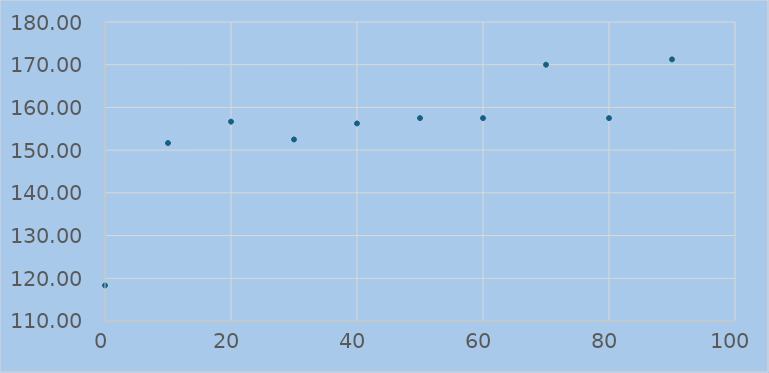
| Category | Series 0 |
|---|---|
| 0.0 | 118.333 |
| 10.0 | 151.667 |
| 20.0 | 156.667 |
| 30.0 | 152.5 |
| 40.0 | 156.25 |
| 50.0 | 157.5 |
| 60.0 | 157.5 |
| 70.0 | 170 |
| 80.0 | 157.5 |
| 90.0 | 171.25 |